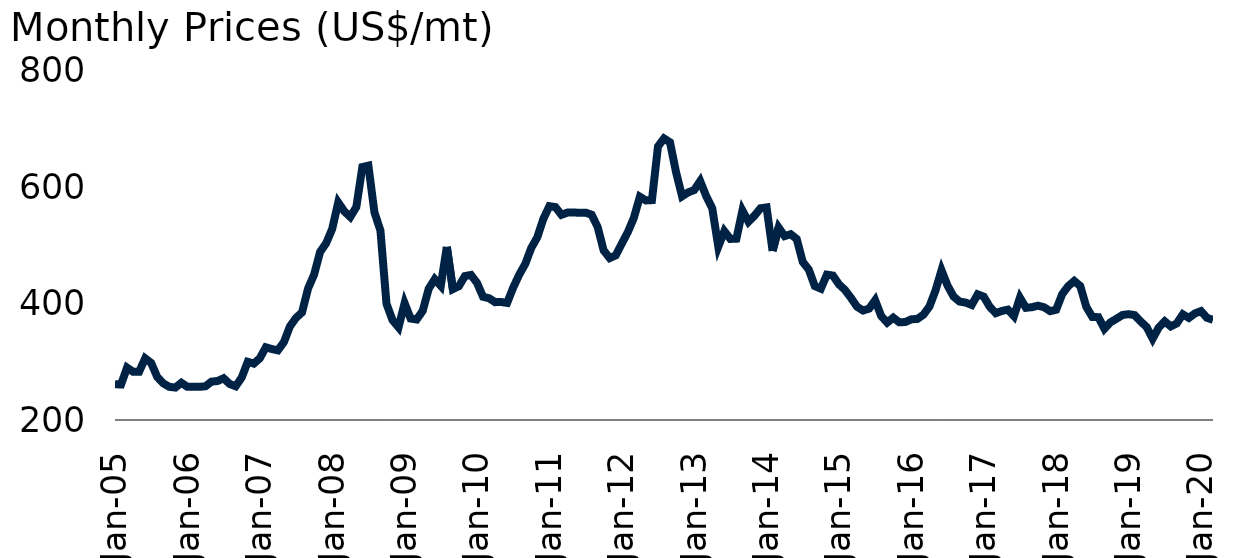
| Category | Soybeans |
|---|---|
| 2005-01-01 | 261.5 |
| 2005-02-01 | 261 |
| 2005-03-01 | 290 |
| 2005-04-01 | 283 |
| 2005-05-01 | 283 |
| 2005-06-01 | 306 |
| 2005-07-01 | 298 |
| 2005-08-01 | 274 |
| 2005-09-01 | 263 |
| 2005-10-01 | 257 |
| 2005-11-01 | 255.75 |
| 2005-12-01 | 264 |
| 2006-01-01 | 257 |
| 2006-02-01 | 257 |
| 2006-03-01 | 257 |
| 2006-04-01 | 258 |
| 2006-05-01 | 266 |
| 2006-06-01 | 267 |
| 2006-07-01 | 271.75 |
| 2006-08-01 | 262 |
| 2006-09-01 | 258 |
| 2006-10-01 | 273 |
| 2006-11-01 | 300 |
| 2006-12-01 | 297 |
| 2007-01-01 | 306 |
| 2007-02-01 | 325 |
| 2007-03-01 | 322 |
| 2007-04-01 | 319.75 |
| 2007-05-01 | 334 |
| 2007-06-01 | 361 |
| 2007-07-01 | 375.5 |
| 2007-08-01 | 385 |
| 2007-09-01 | 426 |
| 2007-10-01 | 450 |
| 2007-11-01 | 489 |
| 2007-12-01 | 503.99 |
| 2008-01-01 | 528.5 |
| 2008-02-01 | 574.01 |
| 2008-03-01 | 558.86 |
| 2008-04-01 | 549.11 |
| 2008-05-01 | 566.12 |
| 2008-06-01 | 634.85 |
| 2008-07-01 | 637.25 |
| 2008-08-01 | 557.28 |
| 2008-09-01 | 525.48 |
| 2008-10-01 | 399.87 |
| 2008-11-01 | 371.76 |
| 2008-12-01 | 359.35 |
| 2009-01-01 | 400.92 |
| 2009-02-01 | 374.45 |
| 2009-03-01 | 372.75 |
| 2009-04-01 | 387.55 |
| 2009-05-01 | 425.72 |
| 2009-06-01 | 442.09 |
| 2009-07-01 | 430.61 |
| 2009-08-01 | 497.53 |
| 2009-09-01 | 425.01 |
| 2009-10-01 | 430.08 |
| 2009-11-01 | 447.41 |
| 2009-12-01 | 449.35 |
| 2010-01-01 | 435.88 |
| 2010-02-01 | 411.86 |
| 2010-03-01 | 409.36 |
| 2010-04-01 | 402.6 |
| 2010-05-01 | 402.87 |
| 2010-06-01 | 401.33 |
| 2010-07-01 | 427.53 |
| 2010-08-01 | 449.84 |
| 2010-09-01 | 468.26 |
| 2010-10-01 | 495.79 |
| 2010-11-01 | 514.15 |
| 2010-12-01 | 545.75 |
| 2011-01-01 | 567.62 |
| 2011-02-01 | 566.05 |
| 2011-03-01 | 552.75 |
| 2011-04-01 | 556.58 |
| 2011-05-01 | 556.8 |
| 2011-06-01 | 556.22 |
| 2011-07-01 | 556.5 |
| 2011-08-01 | 552.96 |
| 2011-09-01 | 531.95 |
| 2011-10-01 | 491.42 |
| 2011-11-01 | 478.35 |
| 2011-12-01 | 483.03 |
| 2012-01-01 | 503.18 |
| 2012-02-01 | 522.96 |
| 2012-03-01 | 547.46 |
| 2012-04-01 | 583.83 |
| 2012-05-01 | 577.48 |
| 2012-06-01 | 578.01 |
| 2012-07-01 | 670.19 |
| 2012-08-01 | 684.02 |
| 2012-09-01 | 677.32 |
| 2012-10-01 | 625.76 |
| 2012-11-01 | 584.59 |
| 2012-12-01 | 591.29 |
| 2013-01-01 | 595.3 |
| 2013-02-01 | 610.73 |
| 2013-03-01 | 584.7 |
| 2013-04-01 | 563.88 |
| 2013-05-01 | 498.01 |
| 2013-06-01 | 524.66 |
| 2013-07-01 | 511.3 |
| 2013-08-01 | 511.71 |
| 2013-09-01 | 560.18 |
| 2013-10-01 | 540.85 |
| 2013-11-01 | 551.32 |
| 2013-12-01 | 564.03 |
| 2014-01-01 | 565.5 |
| 2014-02-01 | 490.73 |
| 2014-03-01 | 530.81 |
| 2014-04-01 | 516.18 |
| 2014-05-01 | 519.42 |
| 2014-06-01 | 511.14 |
| 2014-07-01 | 471.74 |
| 2014-08-01 | 458.57 |
| 2014-09-01 | 430.17 |
| 2014-10-01 | 425.81 |
| 2014-11-01 | 449.9 |
| 2014-12-01 | 448.32 |
| 2015-01-01 | 433.21 |
| 2015-02-01 | 423.55 |
| 2015-03-01 | 409.79 |
| 2015-04-01 | 394.73 |
| 2015-05-01 | 388.2 |
| 2015-06-01 | 391.48 |
| 2015-07-01 | 405.87 |
| 2015-08-01 | 378.78 |
| 2015-09-01 | 367.49 |
| 2015-10-01 | 375.95 |
| 2015-11-01 | 368 |
| 2015-12-01 | 368.42 |
| 2016-01-01 | 373.08 |
| 2016-02-01 | 373.75 |
| 2016-03-01 | 380.97 |
| 2016-04-01 | 395.14 |
| 2016-05-01 | 422.55 |
| 2016-06-01 | 457.4 |
| 2016-07-01 | 431.08 |
| 2016-08-01 | 412.17 |
| 2016-09-01 | 403.53 |
| 2016-10-01 | 401.87 |
| 2016-11-01 | 397.76 |
| 2016-12-01 | 416.07 |
| 2017-01-01 | 412 |
| 2017-02-01 | 394.531 |
| 2017-03-01 | 383.682 |
| 2017-04-01 | 387.44 |
| 2017-05-01 | 389.72 |
| 2017-06-01 | 378.59 |
| 2017-07-01 | 410.23 |
| 2017-08-01 | 392.87 |
| 2017-09-01 | 393.95 |
| 2017-10-01 | 396.52 |
| 2017-11-01 | 393.85 |
| 2017-12-01 | 387.155 |
| 2018-01-01 | 389.53 |
| 2018-02-01 | 416.28 |
| 2018-03-01 | 430.11 |
| 2018-04-01 | 439.07 |
| 2018-05-01 | 430.32 |
| 2018-06-01 | 394.44 |
| 2018-07-01 | 377.17 |
| 2018-08-01 | 376.77 |
| 2018-09-01 | 356.87 |
| 2018-10-01 | 367.96 |
| 2018-11-01 | 374.04 |
| 2018-12-01 | 380.53 |
| 2019-01-01 | 381.96 |
| 2019-02-01 | 380.33 |
| 2019-03-01 | 369.53 |
| 2019-04-01 | 359.84 |
| 2019-05-01 | 339.81 |
| 2019-06-01 | 358.95 |
| 2019-07-01 | 369.58 |
| 2019-08-01 | 360.93 |
| 2019-09-01 | 366.07 |
| 2019-10-01 | 381.65 |
| 2019-11-01 | 375.51 |
| 2019-12-01 | 383.2 |
| 2020-01-01 | 387.23 |
| 2020-02-01 | 375.63 |
| 2020-03-01 | 372.29 |